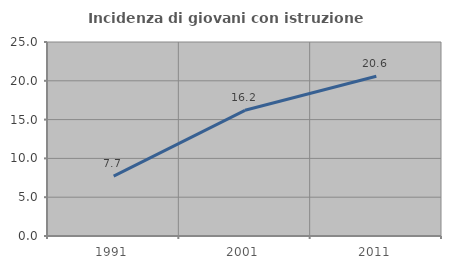
| Category | Incidenza di giovani con istruzione universitaria |
|---|---|
| 1991.0 | 7.722 |
| 2001.0 | 16.199 |
| 2011.0 | 20.588 |